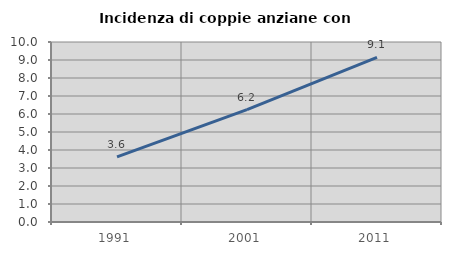
| Category | Incidenza di coppie anziane con figli |
|---|---|
| 1991.0 | 3.622 |
| 2001.0 | 6.245 |
| 2011.0 | 9.147 |